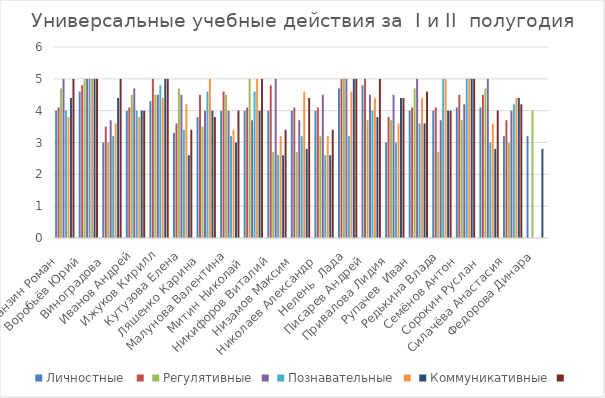
| Category | Личностные  | Series 1 | Регулятивные | Series 3 | Познавательные | Series 5 | Коммуникативные | Series 7 |
|---|---|---|---|---|---|---|---|---|
| Аранзин Роман   | 4 | 4.1 | 4.7 | 5 | 4 | 3.8 | 4.4 | 5 |
| Воробьёв Юрий   | 4.6 | 4.8 | 5 | 5 | 5 | 5 | 5 | 5 |
| Виноградова   | 3 | 3.5 | 3 | 3.7 | 3.2 | 3.6 | 4.4 | 5 |
| Иванов Андрей | 4 | 4.1 | 4.5 | 4.7 | 4 | 3.8 | 4 | 4 |
| Ижуков Кирилл | 4.3 | 5 | 4.5 | 4.5 | 4.8 | 4.4 | 5 | 5 |
| Кутузова Елена | 3.3 | 3.6 | 4.7 | 4.5 | 3.4 | 4.2 | 2.6 | 3.4 |
| Ляшенко Карина   | 3.8 | 4.5 | 3.5 | 4 | 4.6 | 5 | 4 | 3.8 |
| Малунова Валентина | 4 | 4.6 | 4.5 | 4 | 3.2 | 3.4 | 3 | 4 |
| Митин Николай    | 4 | 4.1 | 5 | 3.7 | 4.6 | 5 | 4 | 5 |
| Никифоров Виталий   | 4 | 4.8 | 2.7 | 5 | 2.6 | 3.2 | 2.6 | 3.4 |
| Низамов Максим   | 4 | 4.1 | 2.7 | 3.7 | 3.2 | 4.6 | 2.8 | 4.4 |
| Николаев Александр   | 4 | 4.1 | 3.2 | 4.5 | 2.6 | 3.2 | 2.6 | 3.4 |
| Нелень  Лада | 4.7 | 5 | 5 | 5 | 3.2 | 4.6 | 5 | 5 |
| Писарев Андрей   | 4.8 | 5 | 3.7 | 4.5 | 4 | 4.4 | 3.8 | 5 |
| Привалова Лидия   | 3 | 3.8 | 3.7 | 4.5 | 3 | 3.6 | 4.4 | 4.4 |
| Рупачев  Иван   | 4 | 4.1 | 4.7 | 5 | 3.6 | 4.4 | 3.6 | 4.6 |
| Редькина Влада | 4 | 4.1 | 2.7 | 3.7 | 5 | 5 | 4 | 4 |
| Семёнов Антон   | 4.1 | 4.5 | 3.7 | 4.2 | 5 | 5 | 5 | 5 |
| Сорокин Руслан    | 4.1 | 4.5 | 4.7 | 5 | 3 | 3.6 | 2.8 | 4 |
| Силачёва Анастасия   | 3.2 | 3.7 | 3 | 4 | 4.2 | 4.4 | 4.4 | 4.2 |
| Федорова Динара | 3.2 | 0 | 4 | 0 | 0 | 0 | 2.8 | 0 |